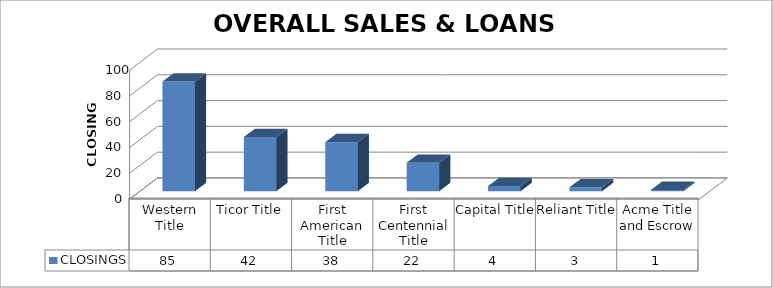
| Category | CLOSINGS |
|---|---|
| Western Title | 85 |
| Ticor Title | 42 |
| First American Title | 38 |
| First Centennial Title | 22 |
| Capital Title | 4 |
| Reliant Title | 3 |
| Acme Title and Escrow | 1 |